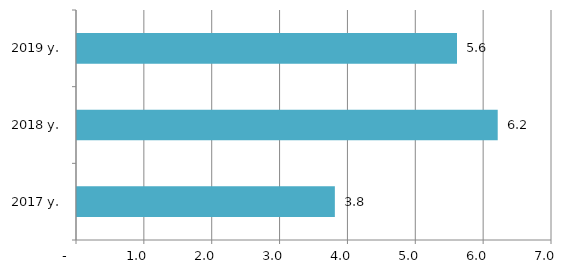
| Category | Series 0 |
|---|---|
| 2017 y. | 3.8 |
| 2018 y. | 6.2 |
| 2019 y. | 5.6 |